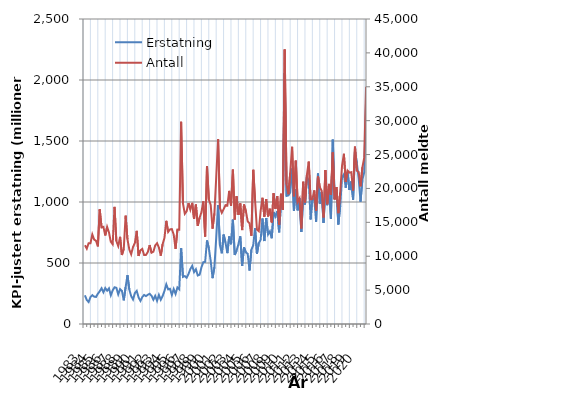
| Category | Erstatning |
|---|---|
| 1983.0 | 235.159 |
| nan | 196.982 |
| nan | 180.14 |
| nan | 220.664 |
| 1984.0 | 236.624 |
| nan | 223.829 |
| nan | 221.923 |
| nan | 248.222 |
| 1985.0 | 268.237 |
| nan | 293.19 |
| nan | 259.801 |
| nan | 294.649 |
| 1986.0 | 273.185 |
| nan | 292.32 |
| nan | 235.278 |
| nan | 275.329 |
| 1987.0 | 300.792 |
| nan | 296.826 |
| nan | 242.905 |
| nan | 285.785 |
| 1988.0 | 272.01 |
| nan | 193.901 |
| nan | 302.006 |
| nan | 400.073 |
| 1989.0 | 282.643 |
| nan | 228.443 |
| nan | 201.011 |
| nan | 253.597 |
| 1990.0 | 271.536 |
| nan | 218.451 |
| nan | 189.456 |
| nan | 220.519 |
| 1991.0 | 237.961 |
| nan | 228.799 |
| nan | 239.453 |
| nan | 247.565 |
| 1992.0 | 231.271 |
| nan | 199.276 |
| nan | 230.258 |
| nan | 190.009 |
| 1993.0 | 238.409 |
| nan | 198.409 |
| nan | 229.227 |
| nan | 271.182 |
| 1994.0 | 324.8 |
| nan | 283.949 |
| nan | 288.489 |
| nan | 237.786 |
| 1995.0 | 286.483 |
| nan | 246.46 |
| nan | 299.475 |
| nan | 284.336 |
| 1996.0 | 623.548 |
| nan | 386.111 |
| nan | 393.009 |
| nan | 379.027 |
| 1997.0 | 410.33 |
| nan | 450.267 |
| nan | 476.838 |
| nan | 425.45 |
| 1998.0 | 448.839 |
| nan | 397.629 |
| nan | 404.125 |
| nan | 464.496 |
| 1999.0 | 506.632 |
| nan | 509.093 |
| nan | 685.049 |
| nan | 620.403 |
| 2000.0 | 517.147 |
| nan | 375.562 |
| nan | 465.591 |
| nan | 709.882 |
| 2001.0 | 974.232 |
| nan | 644.945 |
| nan | 579.247 |
| nan | 732.866 |
| 2002.0 | 667.462 |
| nan | 580.757 |
| nan | 717.716 |
| nan | 653.999 |
| 2003.0 | 855.341 |
| nan | 565.52 |
| nan | 601.642 |
| nan | 655.4 |
| 2004.0 | 719.01 |
| nan | 475.361 |
| nan | 628.446 |
| nan | 587.404 |
| 2005.0 | 574.925 |
| nan | 438.747 |
| nan | 609.1 |
| nan | 645.493 |
| 2006.0 | 784.607 |
| nan | 575.401 |
| nan | 662.07 |
| nan | 690.722 |
| 2007.0 | 864.576 |
| nan | 679.739 |
| nan | 868.481 |
| nan | 734.285 |
| 2008.0 | 759.346 |
| nan | 702.963 |
| nan | 918.111 |
| nan | 881.751 |
| 2009.0 | 925.299 |
| nan | 751.195 |
| nan | 992.309 |
| nan | 937.939 |
| 2010.0 | 2057.459 |
| nan | 1049.406 |
| nan | 1054.455 |
| nan | 1078.752 |
| 2011.0 | 1274.887 |
| nan | 927.068 |
| nan | 1105.387 |
| nan | 931.58 |
| 2012.0 | 1032.063 |
| nan | 754.533 |
| nan | 1040.289 |
| nan | 979.531 |
| 2013.0 | 1202.967 |
| nan | 1177.931 |
| nan | 857.117 |
| nan | 1035.297 |
| 2014.0 | 1021.082 |
| nan | 838.51 |
| nan | 1233.492 |
| nan | 986.251 |
| 2015.0 | 1082.045 |
| nan | 828.657 |
| nan | 1096.905 |
| nan | 973.926 |
| 2016.0 | 1119.605 |
| nan | 861.802 |
| nan | 1511.447 |
| nan | 1025.517 |
| 2017.0 | 1099.34 |
| nan | 815.353 |
| nan | 962.941 |
| nan | 1202.394 |
| 2018.0 | 1227.471 |
| nan | 1116.671 |
| nan | 1244.702 |
| nan | 1098.191 |
| 2019.0 | 1168.183 |
| nan | 1018.571 |
| nan | 1417.623 |
| nan | 1320.203 |
| 2020.0 | 1193.609 |
| nan | 1002.629 |